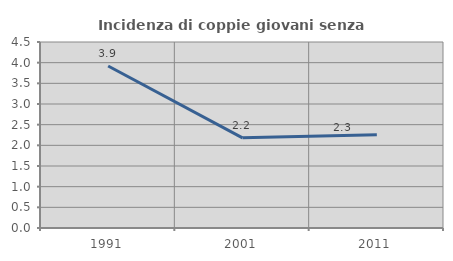
| Category | Incidenza di coppie giovani senza figli |
|---|---|
| 1991.0 | 3.919 |
| 2001.0 | 2.181 |
| 2011.0 | 2.254 |